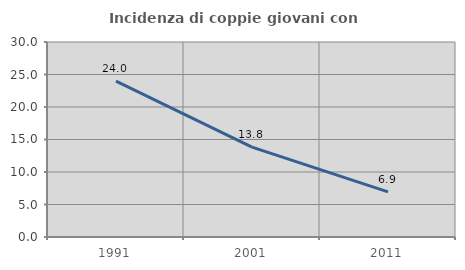
| Category | Incidenza di coppie giovani con figli |
|---|---|
| 1991.0 | 23.973 |
| 2001.0 | 13.826 |
| 2011.0 | 6.94 |